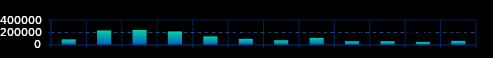
| Category | Series 0 |
|---|---|
| Mar 15 | 89960 |
| Jun 15 | 233314 |
| Sep 15 | 241311 |
| Dec 15 | 217407 |
| Mar 16 | 138289 |
| Jun 16 | 101610 |
| Sep 16 | 76378 |
| Dec 16 | 115010 |